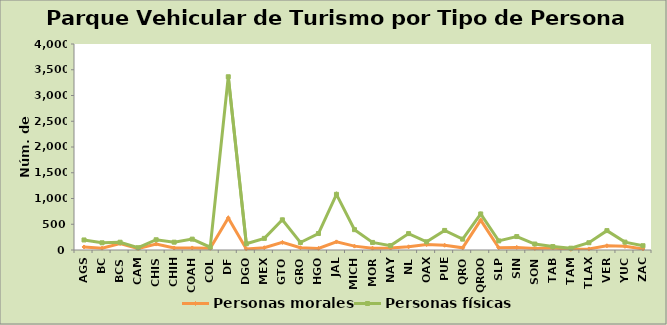
| Category | Personas morales | Personas físicas |
|---|---|---|
| AGS | 59 | 136 |
| BC | 36 | 104 |
| BCS | 126 | 25 |
| CAM | 28 | 16 |
| CHIS | 115 | 84 |
| CHIH | 39 | 113 |
| COAH | 40 | 171 |
| COL | 32 | 22 |
| DF | 621 | 2743 |
| DGO | 21 | 100 |
| MEX | 44 | 182 |
| GTO | 147 | 439 |
| GRO | 44 | 102 |
| HGO | 31 | 289 |
| JAL | 158 | 923 |
| MICH | 75 | 320 |
| MOR | 35 | 112 |
| NAY | 38 | 47 |
| NL | 62 | 256 |
| OAX | 106 | 53 |
| PUE | 92 | 288 |
| QRO | 42 | 169 |
| QROO | 581 | 119 |
| SLP | 44 | 133 |
| SIN | 50 | 211 |
| SON | 30 | 86 |
| TAB | 39 | 28 |
| TAM | 13 | 22 |
| TLAX | 21 | 120 |
| VER | 82 | 294 |
| YUC | 71 | 82 |
| ZAC | 20 | 63 |